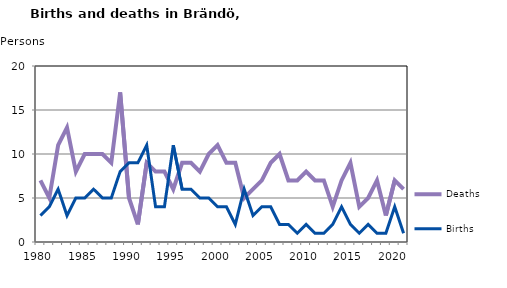
| Category | Deaths | Births |
|---|---|---|
| 1980.0 | 7 | 3 |
| 1981.0 | 5 | 4 |
| 1982.0 | 11 | 6 |
| 1983.0 | 13 | 3 |
| 1984.0 | 8 | 5 |
| 1985.0 | 10 | 5 |
| 1986.0 | 10 | 6 |
| 1987.0 | 10 | 5 |
| 1988.0 | 9 | 5 |
| 1989.0 | 17 | 8 |
| 1990.0 | 5 | 9 |
| 1991.0 | 2 | 9 |
| 1992.0 | 9 | 11 |
| 1993.0 | 8 | 4 |
| 1994.0 | 8 | 4 |
| 1995.0 | 6 | 11 |
| 1996.0 | 9 | 6 |
| 1997.0 | 9 | 6 |
| 1998.0 | 8 | 5 |
| 1999.0 | 10 | 5 |
| 2000.0 | 11 | 4 |
| 2001.0 | 9 | 4 |
| 2002.0 | 9 | 2 |
| 2003.0 | 5 | 6 |
| 2004.0 | 6 | 3 |
| 2005.0 | 7 | 4 |
| 2006.0 | 9 | 4 |
| 2007.0 | 10 | 2 |
| 2008.0 | 7 | 2 |
| 2009.0 | 7 | 1 |
| 2010.0 | 8 | 2 |
| 2011.0 | 7 | 1 |
| 2012.0 | 7 | 1 |
| 2013.0 | 4 | 2 |
| 2014.0 | 7 | 4 |
| 2015.0 | 9 | 2 |
| 2016.0 | 4 | 1 |
| 2017.0 | 5 | 2 |
| 2018.0 | 7 | 1 |
| 2019.0 | 3 | 1 |
| 2020.0 | 7 | 4 |
| 2021.0 | 6 | 1 |